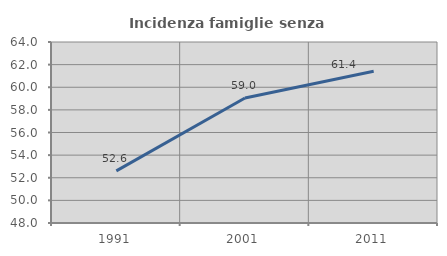
| Category | Incidenza famiglie senza nuclei |
|---|---|
| 1991.0 | 52.609 |
| 2001.0 | 59.048 |
| 2011.0 | 61.413 |